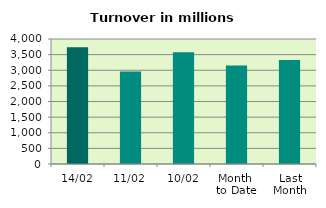
| Category | Series 0 |
|---|---|
| 14/02 | 3737.748 |
| 11/02 | 2962.549 |
| 10/02 | 3577.839 |
| Month 
to Date | 3155.55 |
| Last
Month | 3330.335 |